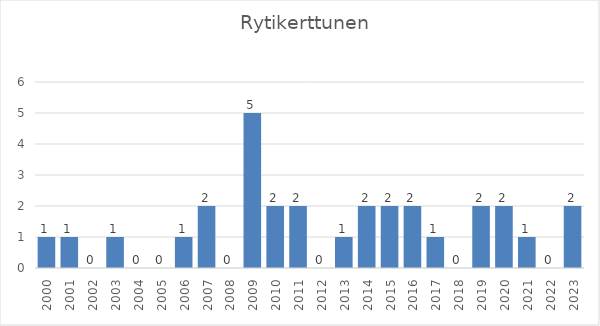
| Category | Series 0 |
|---|---|
| 2000.0 | 1 |
| 2001.0 | 1 |
| 2002.0 | 0 |
| 2003.0 | 1 |
| 2004.0 | 0 |
| 2005.0 | 0 |
| 2006.0 | 1 |
| 2007.0 | 2 |
| 2008.0 | 0 |
| 2009.0 | 5 |
| 2010.0 | 2 |
| 2011.0 | 2 |
| 2012.0 | 0 |
| 2013.0 | 1 |
| 2014.0 | 2 |
| 2015.0 | 2 |
| 2016.0 | 2 |
| 2017.0 | 1 |
| 2018.0 | 0 |
| 2019.0 | 2 |
| 2020.0 | 2 |
| 2021.0 | 1 |
| 2022.0 | 0 |
| 2023.0 | 2 |